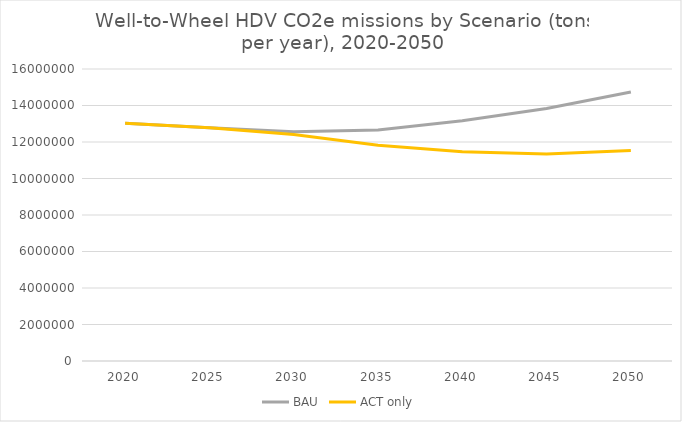
| Category | BAU | ACT only |
|---|---|---|
| 2020.0 | 13028132.574 | 13028132.574 |
| 2025.0 | 12782176.128 | 12782176.128 |
| 2030.0 | 12564438.919 | 12408825.624 |
| 2035.0 | 12662981.767 | 11822547.569 |
| 2040.0 | 13159421.644 | 11468414.093 |
| 2045.0 | 13833547.133 | 11336765.153 |
| 2050.0 | 14737334.199 | 11536756.397 |